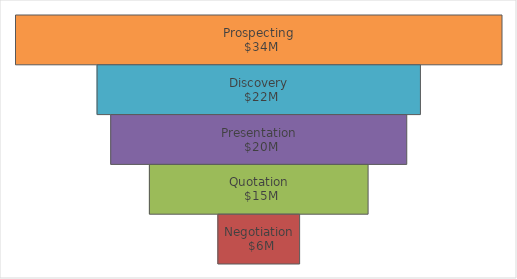
| Category | Filler Series | Sales |
|---|---|---|
| Prospecting | 0 | 33631725 |
| Discovery | 5632718.5 | 22366288 |
| Presentation | 6576980.7 | 20477763.6 |
| Quotation | 9247422.465 | 15136880.07 |
| Negotiation | 13976615 | 5678495 |